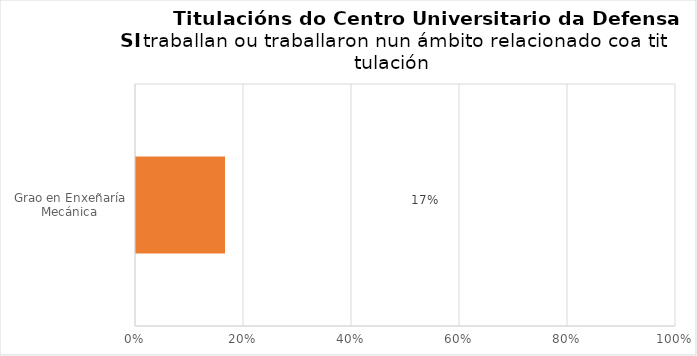
| Category | Series 0 |
|---|---|
| Grao en Enxeñaría Mecánica | 0.167 |